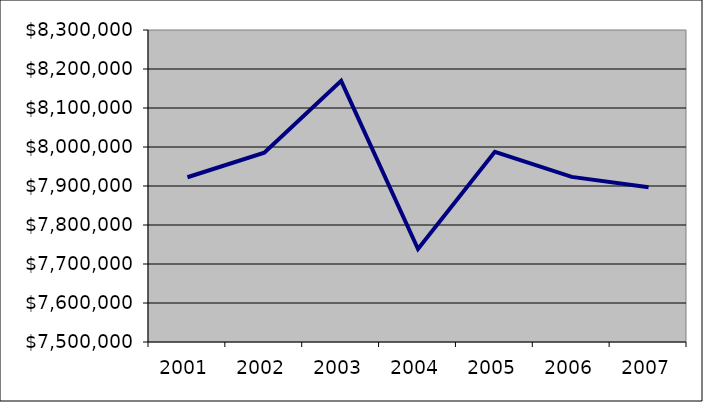
| Category | Roads & Trails Aggregate Substation Depreciation |
|---|---|
| 2001.0 | 7922499.991 |
| 2002.0 | 7985344.534 |
| 2003.0 | 8169483.68 |
| 2004.0 | 7738355.645 |
| 2005.0 | 7987657.382 |
| 2006.0 | 7923410.852 |
| 2007.0 | 7896854.303 |